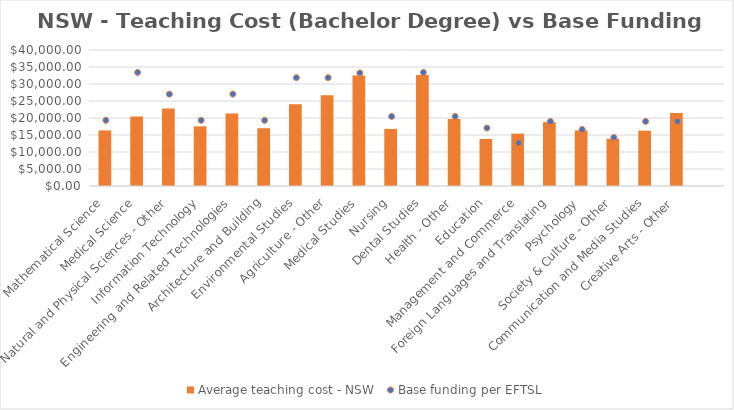
| Category | Average teaching cost - NSW  |
|---|---|
| Mathematical Science | 16344.192 |
| Medical Science | 20466.91 |
| Natural and Physical Sciences - Other | 22829.065 |
| Information Technology | 17558.175 |
| Engineering and Related Technologies | 21299.344 |
| Architecture and Building | 16989.057 |
| Environmental Studies | 24025.657 |
| Agriculture - Other | 26703.131 |
| Medical Studies | 32524.673 |
| Nursing | 16799.075 |
| Dental Studies | 32663.001 |
| Health - Other | 19715.811 |
| Education | 13838.493 |
| Management and Commerce | 15410.248 |
| Foreign Languages and Translating | 18782.473 |
| Psychology | 16355.971 |
| Society & Culture - Other | 13915.066 |
| Communication and Media Studies | 16278.173 |
| Creative Arts - Other | 21497.921 |